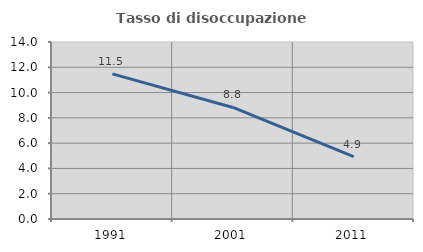
| Category | Tasso di disoccupazione giovanile  |
|---|---|
| 1991.0 | 11.475 |
| 2001.0 | 8.824 |
| 2011.0 | 4.938 |